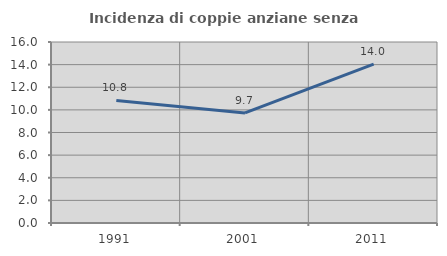
| Category | Incidenza di coppie anziane senza figli  |
|---|---|
| 1991.0 | 10.836 |
| 2001.0 | 9.732 |
| 2011.0 | 14.046 |